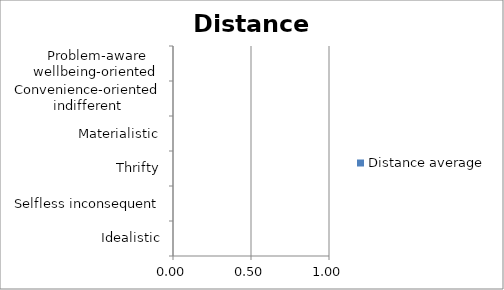
| Category | Distance average |
|---|---|
| Idealistic | 0 |
| Selfless inconsequent | 0 |
| Thrifty | 0 |
| Materialistic | 0 |
| Convenience-oriented indifferent | 0 |
| Problem-aware wellbeing-oriented  | 0 |